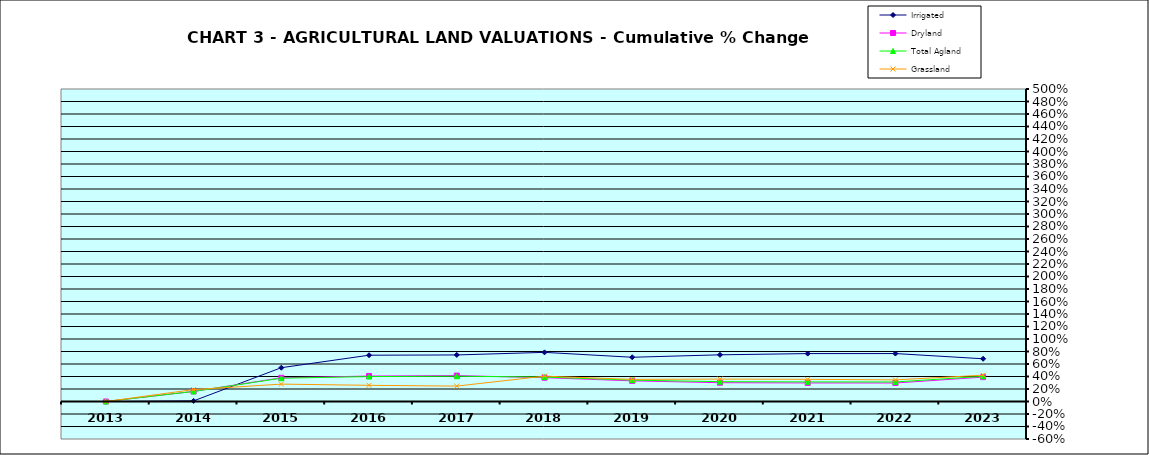
| Category | Irrigated | Dryland | Total Agland | Grassland |
|---|---|---|---|---|
| 2013.0 | 0 | 0 | 0 | 0 |
| 2014.0 | 0.01 | 0.161 | 0.161 | 0.19 |
| 2015.0 | 0.541 | 0.379 | 0.373 | 0.278 |
| 2016.0 | 0.741 | 0.407 | 0.399 | 0.259 |
| 2017.0 | 0.745 | 0.415 | 0.405 | 0.246 |
| 2018.0 | 0.786 | 0.381 | 0.391 | 0.405 |
| 2019.0 | 0.708 | 0.33 | 0.342 | 0.354 |
| 2020.0 | 0.747 | 0.301 | 0.317 | 0.359 |
| 2021.0 | 0.767 | 0.297 | 0.314 | 0.355 |
| 2022.0 | 0.767 | 0.296 | 0.312 | 0.346 |
| 2023.0 | 0.684 | 0.39 | 0.403 | 0.421 |